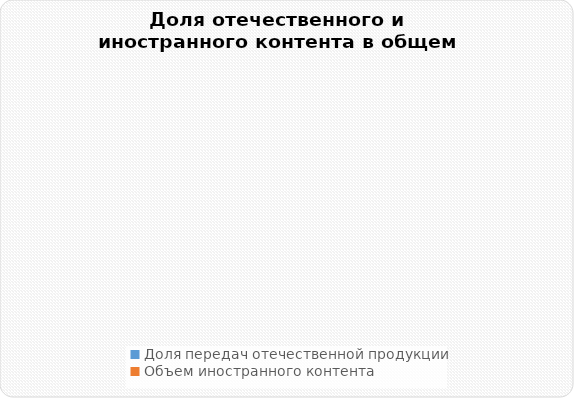
| Category | Series 0 |
|---|---|
| Доля передач отечественной продукции | 0 |
| Объем иностранного контента | 0 |